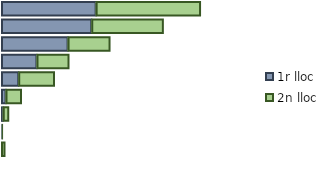
| Category | 1r lloc | 2n lloc |
|---|---|---|
| 0 | 30.429 | 33.575 |
| 1 | 29.021 | 23.024 |
| 2 | 21.402 | 13.498 |
| 3 | 11.387 | 10.309 |
| 4 | 5.536 | 11.506 |
| 5 | 1.447 | 4.97 |
| 6 | 0.537 | 1.818 |
| 7 | 0.24 | 0.211 |
| 8 | 0 | 1.089 |